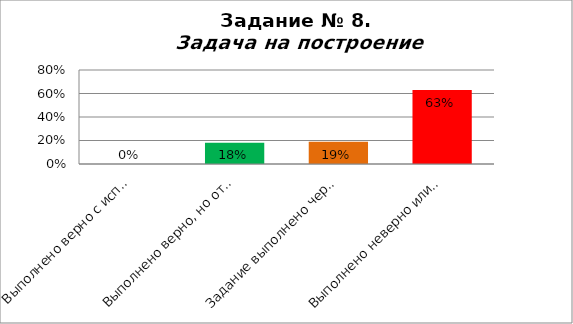
| Category | Задача на построение |
|---|---|
| Выполнено верно с использованием точки пересечения перпендикуляров и проведено обоснование | 0 |
| Выполнено верно, но отстуствует обоснование | 0.18 |
| Задание выполнено через построение вершины С | 0.19 |
| Выполнено неверно или к заданию не приступал | 0.63 |